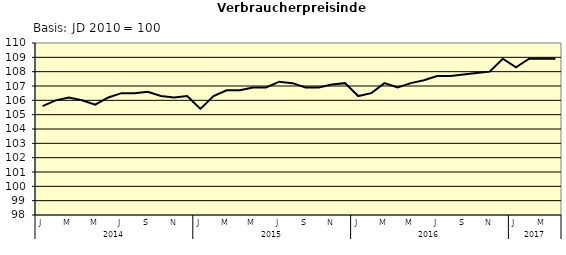
| Category | Series 0 |
|---|---|
| 0 | 105.6 |
| 1 | 106 |
| 2 | 106.2 |
| 3 | 106 |
| 4 | 105.7 |
| 5 | 106.2 |
| 6 | 106.5 |
| 7 | 106.5 |
| 8 | 106.6 |
| 9 | 106.3 |
| 10 | 106.2 |
| 11 | 106.3 |
| 12 | 105.4 |
| 13 | 106.3 |
| 14 | 106.7 |
| 15 | 106.7 |
| 16 | 106.9 |
| 17 | 106.9 |
| 18 | 107.3 |
| 19 | 107.2 |
| 20 | 106.9 |
| 21 | 106.9 |
| 22 | 107.1 |
| 23 | 107.2 |
| 24 | 106.3 |
| 25 | 106.5 |
| 26 | 107.2 |
| 27 | 106.9 |
| 28 | 107.2 |
| 29 | 107.4 |
| 30 | 107.7 |
| 31 | 107.7 |
| 32 | 107.8 |
| 33 | 107.9 |
| 34 | 108 |
| 35 | 108.9 |
| 36 | 108.3 |
| 37 | 108.9 |
| 38 | 108.9 |
| 39 | 108.9 |